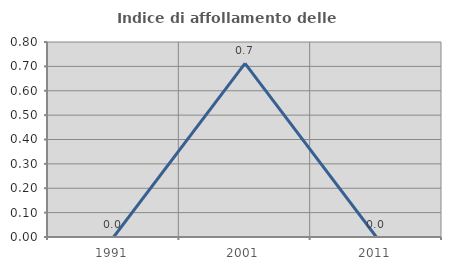
| Category | Indice di affollamento delle abitazioni  |
|---|---|
| 1991.0 | 0 |
| 2001.0 | 0.713 |
| 2011.0 | 0 |